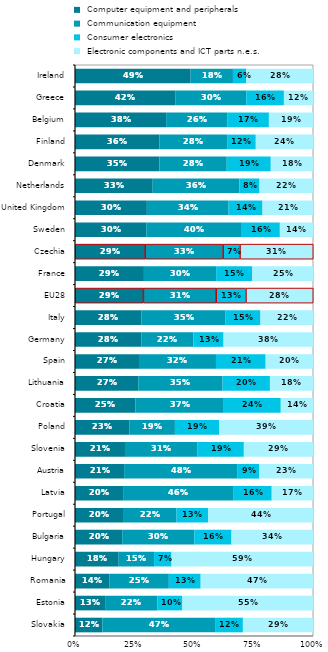
| Category |  Computer equipment and peripherals |  Communication equipment |  Consumer electronics |  Electronic components and ICT parts n.e.s. |
|---|---|---|---|---|
| Slovakia | 0.115 | 0.473 | 0.117 | 0.295 |
| Estonia | 0.126 | 0.22 | 0.104 | 0.549 |
| Romania | 0.144 | 0.25 | 0.134 | 0.472 |
| Hungary | 0.184 | 0.149 | 0.073 | 0.594 |
| Bulgaria | 0.198 | 0.303 | 0.156 | 0.342 |
| Portugal | 0.202 | 0.225 | 0.133 | 0.44 |
| Latvia | 0.202 | 0.465 | 0.16 | 0.173 |
| Austria | 0.206 | 0.477 | 0.09 | 0.226 |
| Slovenia | 0.21 | 0.305 | 0.194 | 0.291 |
| Poland | 0.229 | 0.19 | 0.186 | 0.394 |
| Croatia | 0.254 | 0.371 | 0.24 | 0.135 |
| Lithuania | 0.266 | 0.354 | 0.199 | 0.181 |
| Spain | 0.269 | 0.323 | 0.209 | 0.199 |
| Germany | 0.278 | 0.219 | 0.126 | 0.376 |
| Italy | 0.28 | 0.353 | 0.147 | 0.221 |
| EU28 | 0.287 | 0.306 | 0.125 | 0.283 |
| France | 0.29 | 0.303 | 0.152 | 0.255 |
| Czechia | 0.294 | 0.327 | 0.071 | 0.307 |
| Sweden | 0.3 | 0.401 | 0.16 | 0.139 |
| United Kingdom | 0.302 | 0.343 | 0.143 | 0.212 |
| Netherlands | 0.327 | 0.364 | 0.085 | 0.225 |
| Denmark | 0.355 | 0.283 | 0.185 | 0.177 |
| Finland | 0.355 | 0.284 | 0.12 | 0.24 |
| Belgium | 0.383 | 0.258 | 0.173 | 0.185 |
| Greece | 0.423 | 0.297 | 0.158 | 0.122 |
| Ireland | 0.486 | 0.178 | 0.056 | 0.28 |